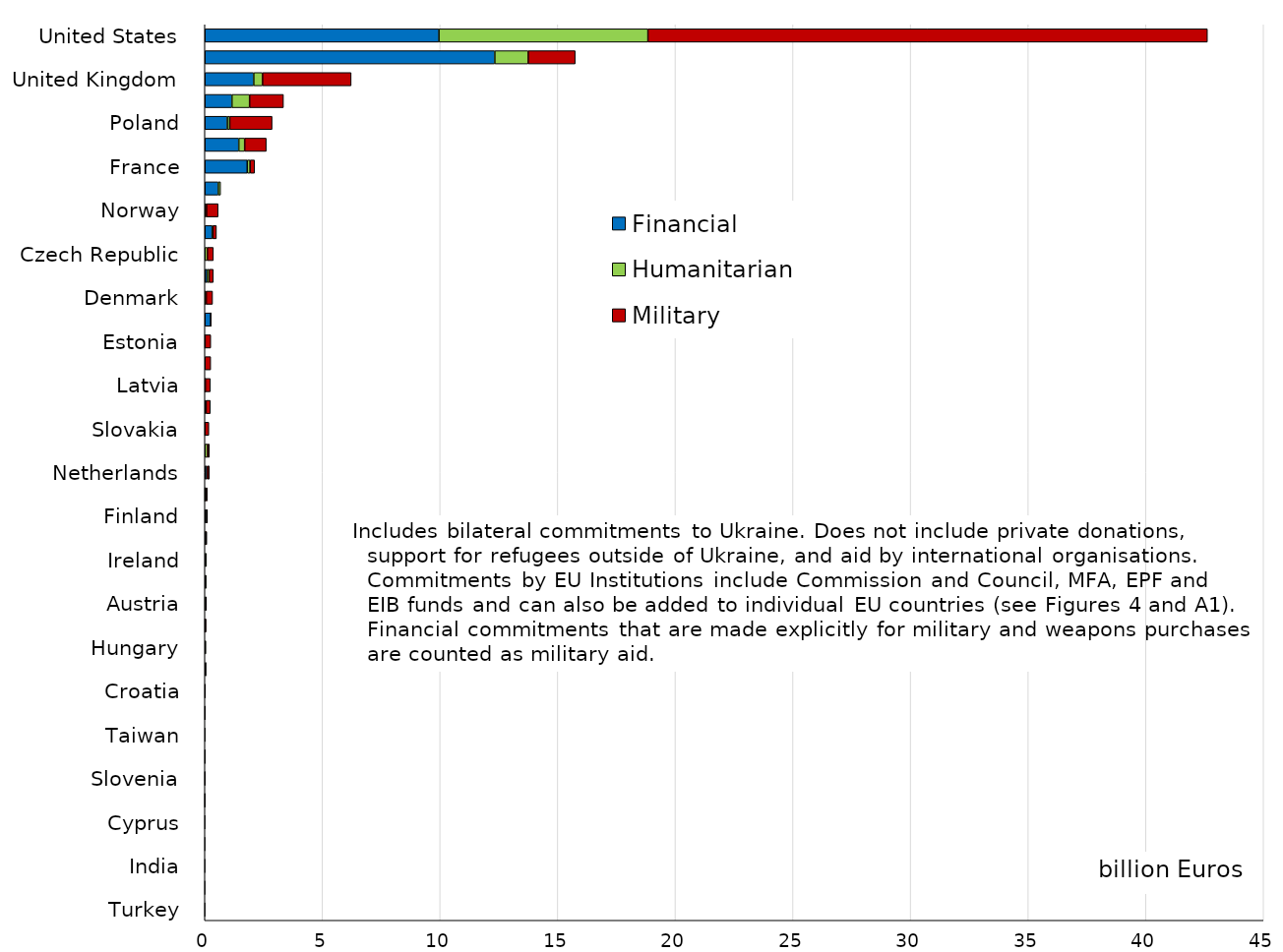
| Category | Financial | Humanitarian | Military |
|---|---|---|---|
| United States | 9.949 | 8.884 | 23.782 |
| EU Institutions | 12.322 | 1.42 | 2 |
| United Kingdom | 2.077 | 0.373 | 3.768 |
| Germany | 1.15 | 0.75 | 1.44 |
| Poland | 0.953 | 0.103 | 1.8 |
| Canada | 1.441 | 0.25 | 0.919 |
| France | 1.8 | 0.119 | 0.194 |
| Japan | 0.568 | 0.098 | 0 |
| Norway | 0.034 | 0.035 | 0.494 |
| Italy | 0.31 | 0.031 | 0.15 |
| Czech Republic | 0 | 0.104 | 0.256 |
| Sweden | 0.091 | 0.085 | 0.182 |
| Denmark | 0.02 | 0.037 | 0.269 |
| Portugal | 0.25 | 0.001 | 0.009 |
| Estonia | 0 | 0.005 | 0.245 |
| Greece | 0 | 0 | 0.247 |
| Latvia | 0.015 | 0.001 | 0.219 |
| Australia | 0 | 0.047 | 0.185 |
| Slovakia | 0 | 0.005 | 0.164 |
| Belgium | 0 | 0.116 | 0.076 |
| Netherlands | 0.08 | 0.027 | 0.084 |
| Lithuania | 0.005 | 0.042 | 0.054 |
| Finland | 0.075 | 0.005 | 0.029 |
| Spain | 0 | 0.044 | 0.037 |
| Ireland | 0 | 0.068 | 0 |
| Switzerland | 0 | 0.059 | 0 |
| Austria | 0.01 | 0.045 | 0.003 |
| Luxembourg | 0 | 0.004 | 0.05 |
| Hungary | 0 | 0.045 | 0 |
| South Korea | 0 | 0.039 | 0.003 |
| Croatia | 0 | 0.006 | 0.016 |
| New Zealand | 0 | 0.002 | 0.014 |
| Taiwan | 0 | 0.012 | 0 |
| Romania | 0 | 0.007 | 0.003 |
| Slovenia | 0 | 0.002 | 0.007 |
| Bulgaria | 0 | 0.001 | 0.004 |
| Cyprus | 0 | 0.002 | 0 |
| China | 0 | 0.002 | 0 |
| India | 0 | 0.002 | 0 |
| Malta | 0 | 0.001 | 0 |
| Turkey | 0 | 0 | 0 |